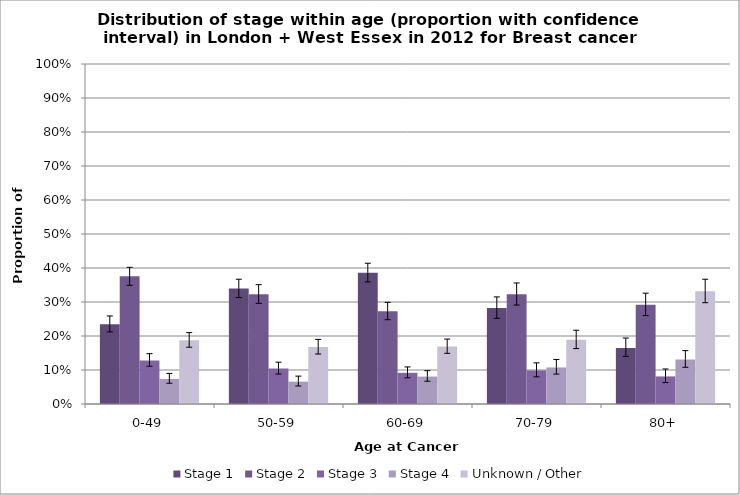
| Category | Stage 1 | Stage 2 | Stage 3 | Stage 4 | Unknown / Other |
|---|---|---|---|---|---|
| 0-49 | 0.235 | 0.375 | 0.128 | 0.074 | 0.188 |
| 50-59 | 0.339 | 0.323 | 0.104 | 0.066 | 0.168 |
| 60-69 | 0.386 | 0.272 | 0.092 | 0.081 | 0.169 |
| 70-79 | 0.282 | 0.322 | 0.099 | 0.108 | 0.189 |
| 80+ | 0.165 | 0.292 | 0.081 | 0.131 | 0.331 |